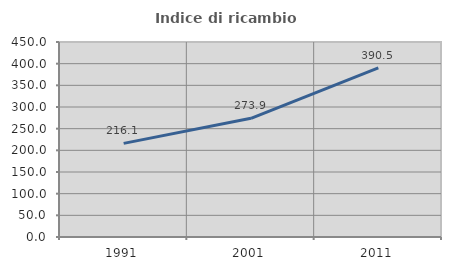
| Category | Indice di ricambio occupazionale  |
|---|---|
| 1991.0 | 216.077 |
| 2001.0 | 273.911 |
| 2011.0 | 390.524 |